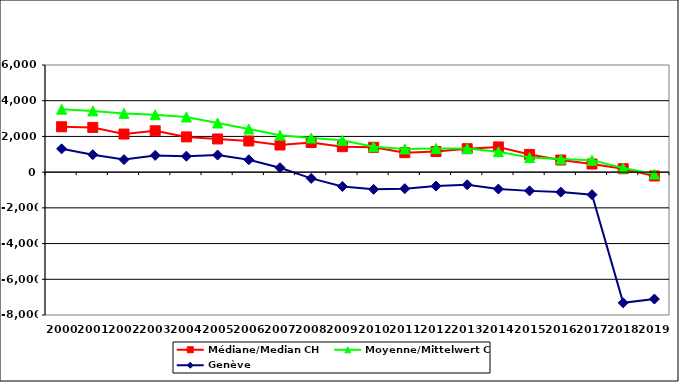
| Category | Médiane/Median CH | Moyenne/Mittelwert CH | Genève |
|---|---|---|---|
| 2000.0 | 2542 | 3524.64 | 1305 |
| 2001.0 | 2505 | 3428.8 | 977 |
| 2002.0 | 2134 | 3290.4 | 703 |
| 2003.0 | 2316 | 3215.6 | 937 |
| 2004.0 | 1974 | 3090.325 | 895 |
| 2005.0 | 1858 | 2756.351 | 958 |
| 2006.0 | 1744.5 | 2416.426 | 694 |
| 2007.0 | 1520 | 2070.521 | 247 |
| 2008.0 | 1660 | 1907.634 | -351 |
| 2009.0 | 1426 | 1780.53 | -801.9 |
| 2010.0 | 1388.8 | 1427.327 | -963.2 |
| 2011.0 | 1091 | 1302.405 | -925.9 |
| 2012.0 | 1157.645 | 1326.071 | -780.6 |
| 2013.0 | 1313 | 1328.597 | -705.74 |
| 2014.0 | 1412.435 | 1147.291 | -947 |
| 2015.0 | 992 | 819.292 | -1049 |
| 2016.0 | 679 | 729.357 | -1118 |
| 2017.0 | 456.291 | 671.325 | -1260 |
| 2018.0 | 191 | 232.403 | -7317.9 |
| 2019.0 | -215 | -106.609 | -7107 |